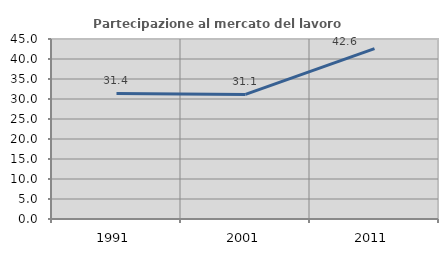
| Category | Partecipazione al mercato del lavoro  femminile |
|---|---|
| 1991.0 | 31.387 |
| 2001.0 | 31.148 |
| 2011.0 | 42.609 |